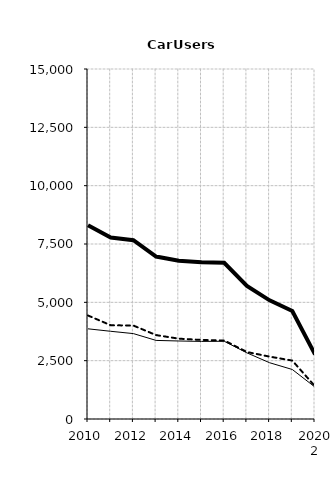
| Category | Built-up | Non built-up | Total |
|---|---|---|---|
| 2010 | 3865 | 4436 | 8301 |
| 2011 | 3759 | 4018 | 7777 |
| 2012 | 3660 | 4005 | 7665 |
| 2013 | 3368 | 3596 | 6964 |
| 2014 | 3343 | 3443 | 6786 |
| 2015 | 3325 | 3388 | 6713 |
| 2016 | 3332 | 3365 | 6697 |
| 2017 | 2835 | 2872 | 5707 |
| 2018 | 2412 | 2673 | 5085 |
| 2019 2 | 2122 | 2504 | 4626 |
| 2020 2 | 1368 | 1401 | 2769 |